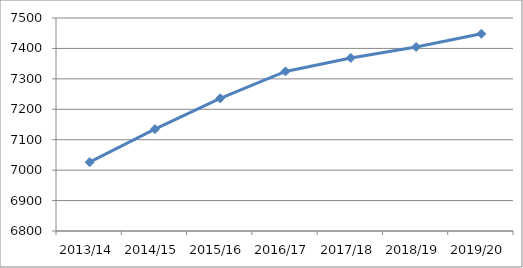
| Category | Series 0 |
|---|---|
| 2013/14 | 7026.07 |
| 2014/15 | 7134.86 |
| 2015/16 | 7236.01 |
| 2016/17 | 7324.34 |
| 2017/18 | 7368.7 |
| 2018/19 | 7404.8 |
| 2019/20 | 7448.25 |